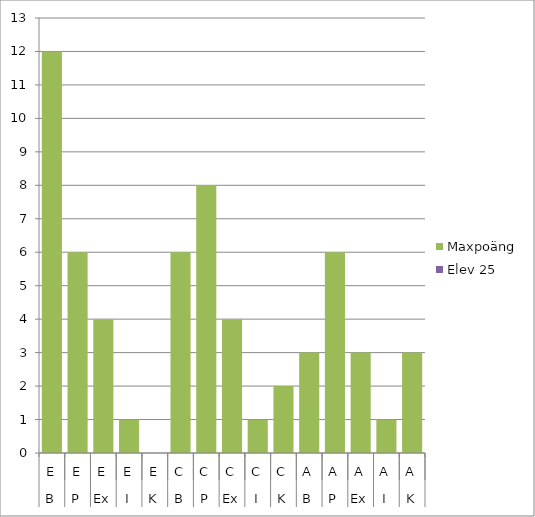
| Category | Maxpoäng | Elev 25 |
|---|---|---|
| 0 | 12 | 0 |
| 1 | 6 | 0 |
| 2 | 4 | 0 |
| 3 | 1 | 0 |
| 4 | 0 | 0 |
| 5 | 6 | 0 |
| 6 | 8 | 0 |
| 7 | 4 | 0 |
| 8 | 1 | 0 |
| 9 | 2 | 0 |
| 10 | 3 | 0 |
| 11 | 6 | 0 |
| 12 | 3 | 0 |
| 13 | 1 | 0 |
| 14 | 3 | 0 |